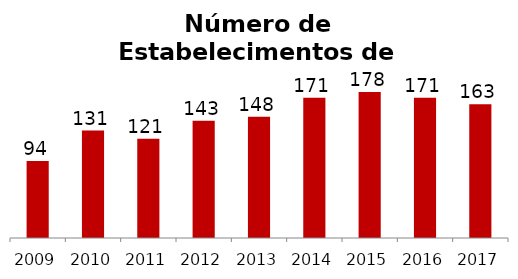
| Category | Alimentação |
|---|---|
| 2009.0 | 94 |
| 2010.0 | 131 |
| 2011.0 | 121 |
| 2012.0 | 143 |
| 2013.0 | 148 |
| 2014.0 | 171 |
| 2015.0 | 178 |
| 2016.0 | 171 |
| 2017.0 | 163 |